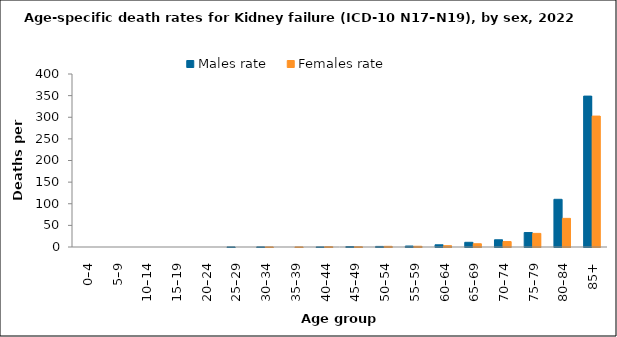
| Category | Males rate | Females rate |
|---|---|---|
| 0–4 | 0 | 0 |
| 5–9 | 0 | 0 |
| 10–14 | 0 | 0 |
| 15–19 | 0 | 0 |
| 20–24 | 0 | 0 |
| 25–29 | 0.216 | 0 |
| 30–34 | 0.317 | 0.207 |
| 35–39 | 0 | 0.21 |
| 40–44 | 0.238 | 0.695 |
| 45–49 | 1.121 | 0.61 |
| 50–54 | 1.352 | 1.548 |
| 55–59 | 2.253 | 1.666 |
| 60–64 | 5.1 | 2.999 |
| 65–69 | 10.84 | 7.549 |
| 70–74 | 16.692 | 12.632 |
| 75–79 | 33.439 | 31.486 |
| 80–84 | 110.263 | 66.189 |
| 85+ | 348.903 | 302.693 |